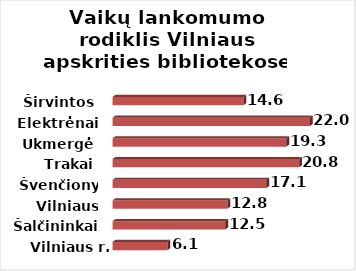
| Category | Series 0 |
|---|---|
| Vilniaus r. | 6.102 |
| Šalčininkai | 12.541 |
| Vilniaus m. | 12.775 |
| Švenčionys | 17.103 |
| Trakai | 20.756 |
| Ukmergė | 19.325 |
| Elektrėnai | 21.962 |
| Širvintos | 14.568 |